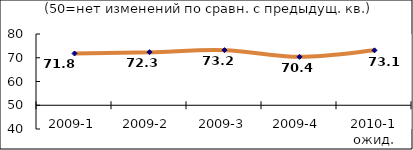
| Category | Диф.индекс ↓ |
|---|---|
| 2009-1 | 71.79 |
| 2009-2 | 72.345 |
| 2009-3 | 73.205 |
| 2009-4 | 70.39 |
| 2010-1 ожид. | 73.125 |